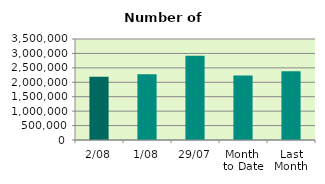
| Category | Series 0 |
|---|---|
| 2/08 | 2191428 |
| 1/08 | 2280770 |
| 29/07 | 2915328 |
| Month 
to Date | 2236099 |
| Last
Month | 2380266.19 |